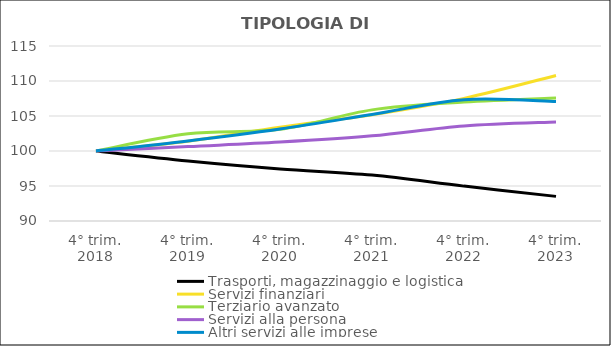
| Category | Trasporti, magazzinaggio e logistica | Servizi finanziari | Terziario avanzato  | Servizi alla persona  | Altri servizi alle imprese |
|---|---|---|---|---|---|
| 4° trim.
2018 | 100 | 100 | 100 | 100 | 100 |
| 4° trim.
2019 | 98.572 | 101.406 | 102.451 | 100.636 | 101.444 |
| 4° trim.
2020 | 97.437 | 103.4 | 103.096 | 101.272 | 103.149 |
| 4° trim.
2021 | 96.558 | 105.165 | 105.877 | 102.165 | 105.221 |
| 4° trim.
2022 | 94.984 | 107.519 | 106.992 | 103.573 | 107.328 |
| 4° trim.
2023 | 93.519 | 110.788 | 107.574 | 104.148 | 107.079 |